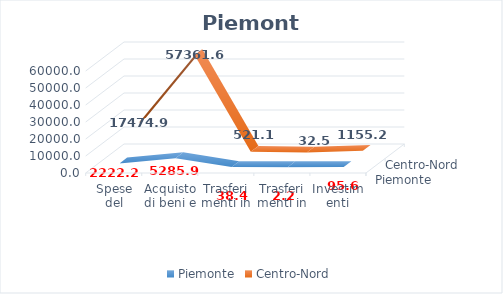
| Category | Piemonte | Centro-Nord |
|---|---|---|
| Spese del personale | 2222.23 | 17474.898 |
| Acquisto di beni e servizi | 5285.91 | 57361.569 |
| Trasferimenti in c/corrente | 38.41 | 521.07 |
| Trasferimenti in c/capitale | 2.22 | 32.472 |
| Investimenti | 95.61 | 1155.171 |